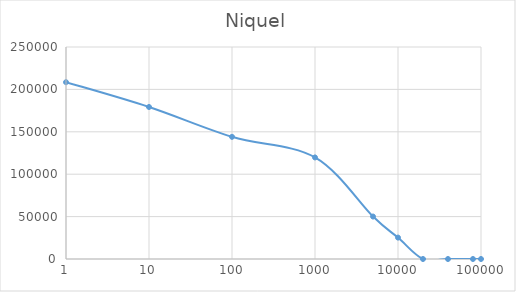
| Category | Niquel |
|---|---|
| 1.0 | 208499.267 |
| 10.0 | 179256.891 |
| 100.0 | 144071.712 |
| 1000.0 | 119769.997 |
| 5000.0 | 50069.535 |
| 10000.0 | 25244.619 |
| 20000.0 | 0 |
| 40000.0 | 0 |
| 80000.0 | 0 |
| 100000.0 | 0 |